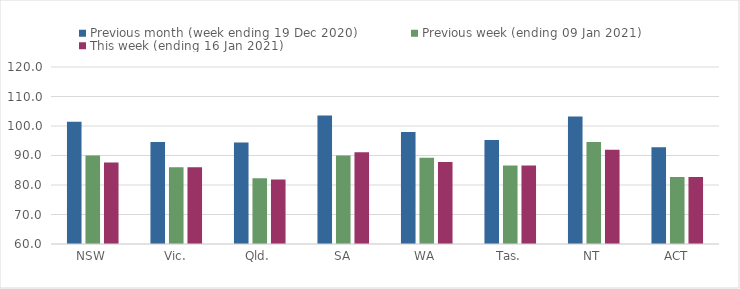
| Category | Previous month (week ending 19 Dec 2020) | Previous week (ending 09 Jan 2021) | This week (ending 16 Jan 2021) |
|---|---|---|---|
| NSW | 101.46 | 90 | 87.62 |
| Vic. | 94.55 | 86 | 86.04 |
| Qld. | 94.4 | 82.31 | 81.83 |
| SA | 103.54 | 90.01 | 91.08 |
| WA | 97.97 | 89.26 | 87.78 |
| Tas. | 95.28 | 86.62 | 86.62 |
| NT | 103.18 | 94.54 | 91.97 |
| ACT | 92.81 | 82.69 | 82.71 |